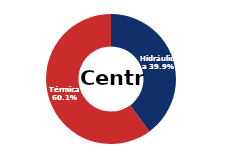
| Category | Centro |
|---|---|
| Eólica | 0 |
| Hidráulica | 1651.339 |
| Solar | 0.006 |
| Térmica | 2484.147 |